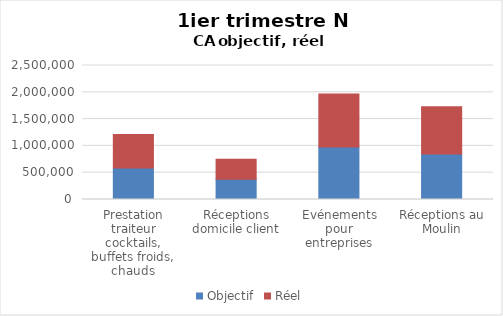
| Category | Objectif | Réel |
|---|---|---|
| Prestation traiteur
cocktails, buffets froids, chauds | 590000 | 624196 |
| Réceptions domicile client | 380000 | 373086 |
| Evénements pour entreprises | 980000 | 988028 |
| Réceptions au Moulin | 850000 | 882588 |